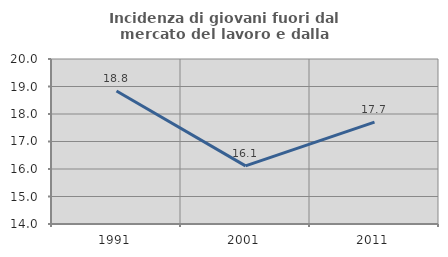
| Category | Incidenza di giovani fuori dal mercato del lavoro e dalla formazione  |
|---|---|
| 1991.0 | 18.837 |
| 2001.0 | 16.115 |
| 2011.0 | 17.706 |